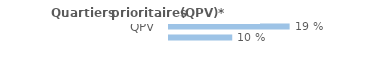
| Category | Series 0 |
|---|---|
| QPV | 0.188 |
| Hors QPV | 0.098 |